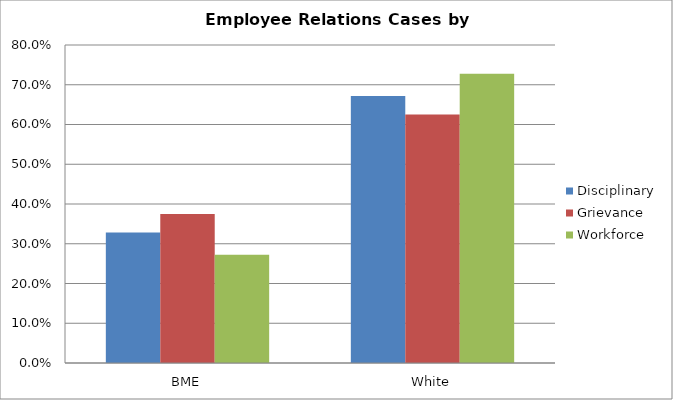
| Category | Disciplinary | Grievance | Workforce |
|---|---|---|---|
| BME | 0.328 | 0.375 | 0.273 |
| White | 0.672 | 0.625 | 0.727 |